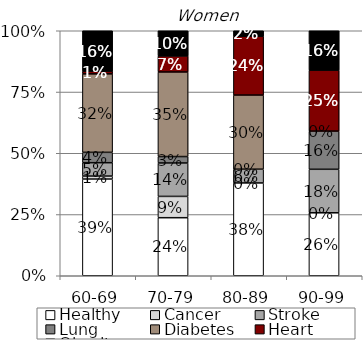
| Category | Healthy | Cancer | Stroke | Lung | Diabetes | Heart | Obesity |
|---|---|---|---|---|---|---|---|
| 60-69 | 0.395 | 0.012 | 0.055 | 0.042 | 0.32 | 0.011 | 0.165 |
| 70-79 | 0.237 | 0.087 | 0.136 | 0.026 | 0.345 | 0.066 | 0.103 |
| 80-89 | 0.379 | 0 | 0.056 | 0 | 0.303 | 0.24 | 0.022 |
| 90-99 | 0.257 | 0 | 0.178 | 0.156 | 0 | 0.249 | 0.161 |